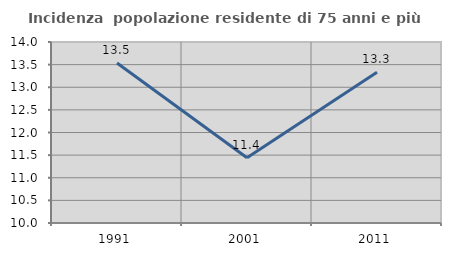
| Category | Incidenza  popolazione residente di 75 anni e più |
|---|---|
| 1991.0 | 13.537 |
| 2001.0 | 11.443 |
| 2011.0 | 13.333 |